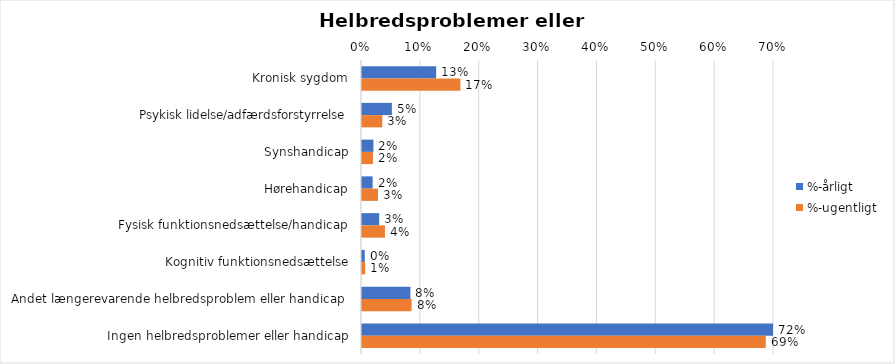
| Category | %-årligt | %-ugentligt |
|---|---|---|
| Kronisk sygdom | 0.126 | 0.167 |
| Psykisk lidelse/adfærdsforstyrrelse | 0.051 | 0.034 |
| Synshandicap | 0.019 | 0.019 |
| Hørehandicap | 0.018 | 0.027 |
| Fysisk funktionsnedsættelse/handicap | 0.029 | 0.039 |
| Kognitiv funktionsnedsættelse | 0.005 | 0.005 |
| Andet længerevarende helbredsproblem eller handicap  | 0.082 | 0.084 |
| Ingen helbredsproblemer eller handicap | 0.722 | 0.686 |